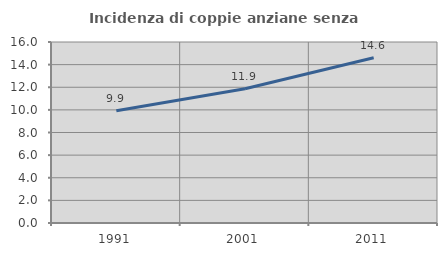
| Category | Incidenza di coppie anziane senza figli  |
|---|---|
| 1991.0 | 9.93 |
| 2001.0 | 11.86 |
| 2011.0 | 14.611 |